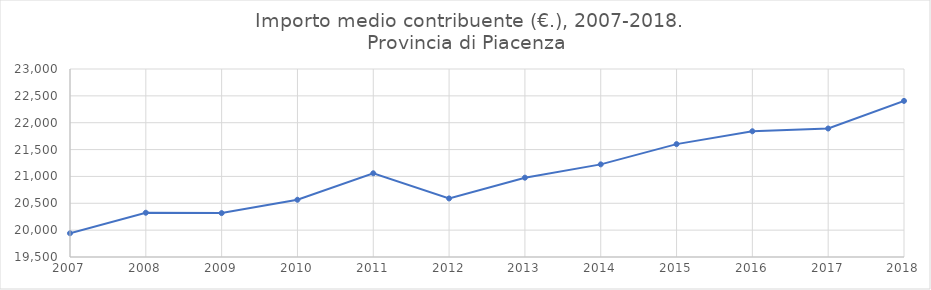
| Category |  PIACENZA  |
|---|---|
| 2007.0 | 19942.185 |
| 2008.0 | 20323.949 |
| 2009.0 | 20317.243 |
| 2010.0 | 20565.706 |
| 2011.0 | 21058.344 |
| 2012.0 | 20590.37 |
| 2013.0 | 20976.823 |
| 2014.0 | 21224.604 |
| 2015.0 | 21601.566 |
| 2016.0 | 21840.744 |
| 2017.0 | 21892.301 |
| 2018.0 | 22406.017 |